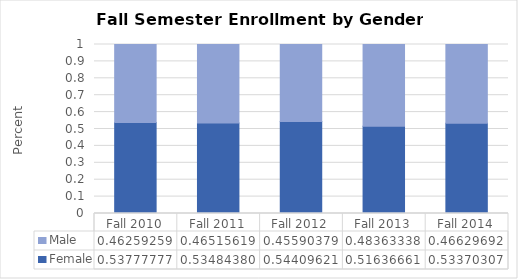
| Category | Female | Male |
|---|---|---|
| Fall 2010 | 0.538 | 0.463 |
| Fall 2011 | 0.535 | 0.465 |
| Fall 2012 | 0.544 | 0.456 |
| Fall 2013 | 0.516 | 0.484 |
| Fall 2014 | 0.534 | 0.466 |